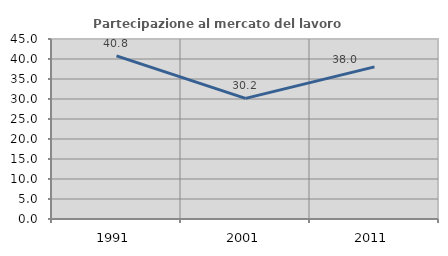
| Category | Partecipazione al mercato del lavoro  femminile |
|---|---|
| 1991.0 | 40.766 |
| 2001.0 | 30.159 |
| 2011.0 | 38.035 |